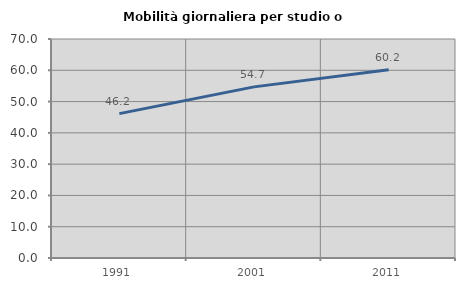
| Category | Mobilità giornaliera per studio o lavoro |
|---|---|
| 1991.0 | 46.154 |
| 2001.0 | 54.701 |
| 2011.0 | 60.204 |